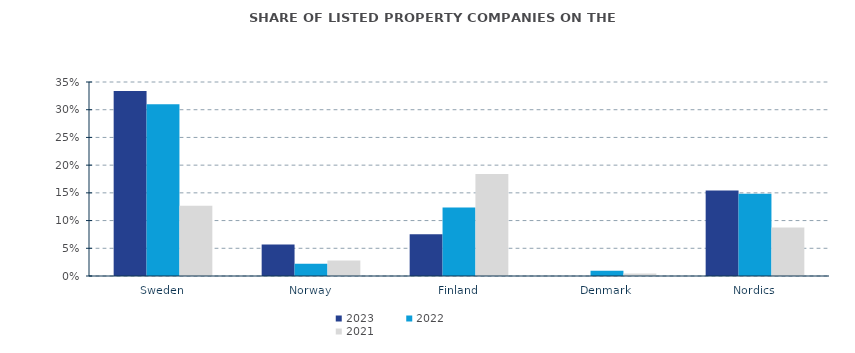
| Category | 2023 | 2022 | 2021 |
|---|---|---|---|
| Sweden | 0.334 | 0.31 | 0.127 |
| Norway | 0.057 | 0.022 | 0.028 |
| Finland | 0.075 | 0.124 | 0.184 |
| Denmark | 0 | 0.009 | 0.005 |
| Nordics | 0.154 | 0.148 | 0.087 |